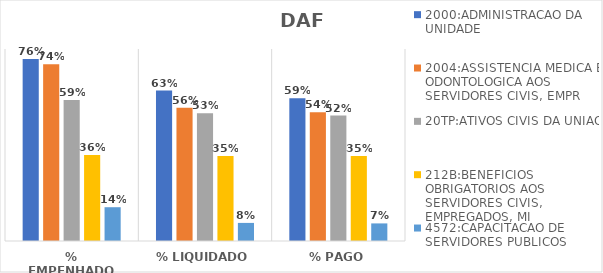
| Category | 2000:ADMINISTRACAO DA UNIDADE | 2004:ASSISTENCIA MEDICA E ODONTOLOGICA AOS SERVIDORES CIVIS, EMPR | 20TP:ATIVOS CIVIS DA UNIAO | 212B:BENEFICIOS OBRIGATORIOS AOS SERVIDORES CIVIS, EMPREGADOS, MI | 4572:CAPACITACAO DE SERVIDORES PUBLICOS FEDERAIS EM PROCESSO DE Q |
|---|---|---|---|---|---|
| % EMPENHADO | 0.758 | 0.736 | 0.587 | 0.358 | 0.141 |
| % LIQUIDADO | 0.627 | 0.556 | 0.532 | 0.355 | 0.075 |
| % PAGO | 0.595 | 0.536 | 0.523 | 0.354 | 0.073 |